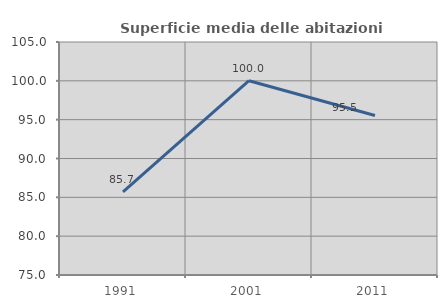
| Category | Superficie media delle abitazioni occupate |
|---|---|
| 1991.0 | 85.699 |
| 2001.0 | 100.015 |
| 2011.0 | 95.536 |